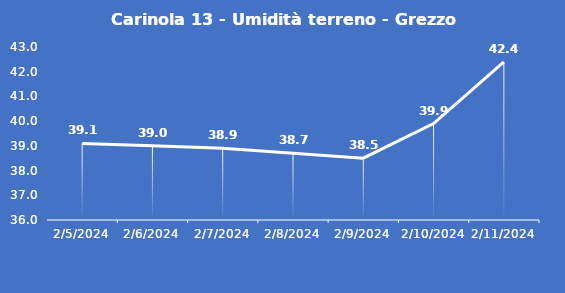
| Category | Carinola 13 - Umidità terreno - Grezzo (%VWC) |
|---|---|
| 2/5/24 | 39.1 |
| 2/6/24 | 39 |
| 2/7/24 | 38.9 |
| 2/8/24 | 38.7 |
| 2/9/24 | 38.5 |
| 2/10/24 | 39.9 |
| 2/11/24 | 42.4 |